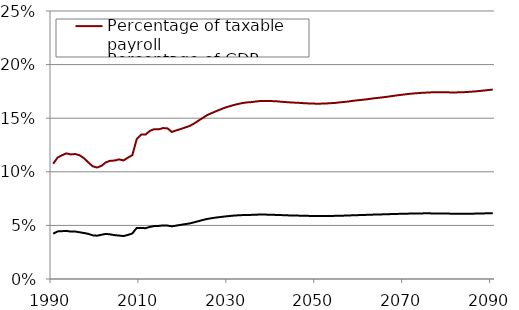
| Category | Percentage of taxable payroll | Percentage of GDP |
|---|---|---|
| 1990.0 | 0.108 | 0.042 |
| 1991.0 | 0.113 | 0.044 |
| 1992.0 | 0.115 | 0.045 |
| 1993.0 | 0.117 | 0.045 |
| 1994.0 | 0.116 | 0.044 |
| 1995.0 | 0.117 | 0.044 |
| 1996.0 | 0.115 | 0.044 |
| 1997.0 | 0.113 | 0.043 |
| 1998.0 | 0.109 | 0.042 |
| 1999.0 | 0.105 | 0.041 |
| 2000.0 | 0.104 | 0.04 |
| 2001.0 | 0.106 | 0.041 |
| 2002.0 | 0.109 | 0.042 |
| 2003.0 | 0.11 | 0.042 |
| 2004.0 | 0.11 | 0.041 |
| 2005.0 | 0.112 | 0.04 |
| 2006.0 | 0.111 | 0.04 |
| 2007.0 | 0.113 | 0.041 |
| 2008.0 | 0.115 | 0.042 |
| 2009.0 | 0.13 | 0.048 |
| 2010.0 | 0.135 | 0.048 |
| 2011.0 | 0.135 | 0.047 |
| 2012.0 | 0.138 | 0.049 |
| 2013.0 | 0.14 | 0.049 |
| 2014.0 | 0.14 | 0.05 |
| 2015.0 | 0.141 | 0.05 |
| 2016.0 | 0.14 | 0.05 |
| 2017.0 | 0.137 | 0.049 |
| 2018.0 | 0.139 | 0.05 |
| 2019.0 | 0.14 | 0.05 |
| 2020.0 | 0.141 | 0.051 |
| 2021.0 | 0.143 | 0.052 |
| 2022.0 | 0.145 | 0.053 |
| 2023.0 | 0.148 | 0.054 |
| 2024.0 | 0.15 | 0.055 |
| 2025.0 | 0.153 | 0.056 |
| 2026.0 | 0.155 | 0.057 |
| 2027.0 | 0.156 | 0.057 |
| 2028.0 | 0.158 | 0.058 |
| 2029.0 | 0.16 | 0.058 |
| 2030.0 | 0.161 | 0.059 |
| 2031.0 | 0.162 | 0.059 |
| 2032.0 | 0.163 | 0.059 |
| 2033.0 | 0.164 | 0.06 |
| 2034.0 | 0.165 | 0.06 |
| 2035.0 | 0.165 | 0.06 |
| 2036.0 | 0.165 | 0.06 |
| 2037.0 | 0.166 | 0.06 |
| 2038.0 | 0.166 | 0.06 |
| 2039.0 | 0.166 | 0.06 |
| 2040.0 | 0.166 | 0.06 |
| 2041.0 | 0.166 | 0.06 |
| 2042.0 | 0.165 | 0.06 |
| 2043.0 | 0.165 | 0.059 |
| 2044.0 | 0.165 | 0.059 |
| 2045.0 | 0.164 | 0.059 |
| 2046.0 | 0.164 | 0.059 |
| 2047.0 | 0.164 | 0.059 |
| 2048.0 | 0.164 | 0.059 |
| 2049.0 | 0.164 | 0.059 |
| 2050.0 | 0.163 | 0.059 |
| 2051.0 | 0.164 | 0.059 |
| 2052.0 | 0.164 | 0.059 |
| 2053.0 | 0.164 | 0.059 |
| 2054.0 | 0.164 | 0.059 |
| 2055.0 | 0.165 | 0.059 |
| 2056.0 | 0.165 | 0.059 |
| 2057.0 | 0.165 | 0.059 |
| 2058.0 | 0.166 | 0.059 |
| 2059.0 | 0.167 | 0.06 |
| 2060.0 | 0.167 | 0.06 |
| 2061.0 | 0.168 | 0.06 |
| 2062.0 | 0.168 | 0.06 |
| 2063.0 | 0.169 | 0.06 |
| 2064.0 | 0.169 | 0.06 |
| 2065.0 | 0.169 | 0.06 |
| 2066.0 | 0.17 | 0.06 |
| 2067.0 | 0.171 | 0.061 |
| 2068.0 | 0.171 | 0.061 |
| 2069.0 | 0.172 | 0.061 |
| 2070.0 | 0.172 | 0.061 |
| 2071.0 | 0.173 | 0.061 |
| 2072.0 | 0.173 | 0.061 |
| 2073.0 | 0.173 | 0.061 |
| 2074.0 | 0.174 | 0.061 |
| 2075.0 | 0.174 | 0.061 |
| 2076.0 | 0.174 | 0.061 |
| 2077.0 | 0.174 | 0.061 |
| 2078.0 | 0.174 | 0.061 |
| 2079.0 | 0.174 | 0.061 |
| 2080.0 | 0.174 | 0.061 |
| 2081.0 | 0.174 | 0.061 |
| 2082.0 | 0.174 | 0.061 |
| 2083.0 | 0.174 | 0.061 |
| 2084.0 | 0.174 | 0.061 |
| 2085.0 | 0.175 | 0.061 |
| 2086.0 | 0.175 | 0.061 |
| 2087.0 | 0.175 | 0.061 |
| 2088.0 | 0.176 | 0.061 |
| 2089.0 | 0.176 | 0.061 |
| 2090.0 | 0.177 | 0.061 |